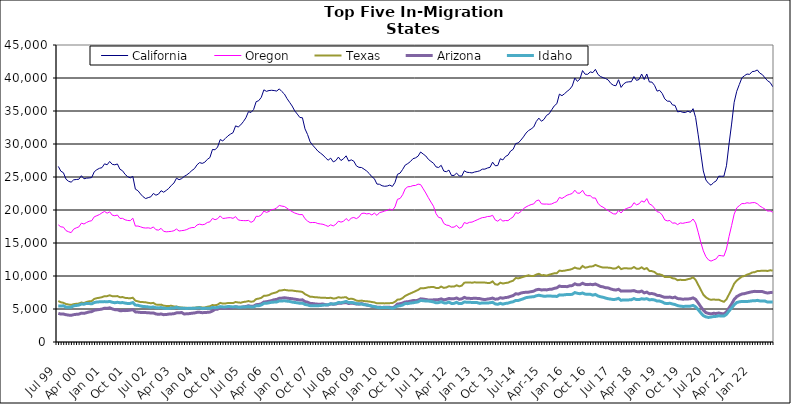
| Category | California | Oregon | Texas | Arizona | Idaho |
|---|---|---|---|---|---|
| Jul 99 | 26605 | 17749 | 6209 | 4339 | 5471 |
| Aug 99 | 25882 | 17447 | 6022 | 4228 | 5444 |
| Sep 99 | 25644 | 17401 | 5941 | 4237 | 5488 |
| Oct 99 | 24669 | 16875 | 5751 | 4134 | 5279 |
| Nov 99 | 24353 | 16701 | 5680 | 4073 | 5260 |
| Dec 99 | 24218 | 16570 | 5619 | 4042 | 5269 |
| Jan 00 | 24574 | 17109 | 5736 | 4142 | 5485 |
| Feb 00 | 24620 | 17295 | 5789 | 4192 | 5530 |
| Mar 00 | 24655 | 17436 | 5826 | 4226 | 5590 |
| Apr 00 | 25195 | 18009 | 5980 | 4375 | 5748 |
| May 00 | 24730 | 17875 | 5897 | 4337 | 5729 |
| Jun 00 | 24825 | 18113 | 6070 | 4444 | 5853 |
| Jul 00 | 24857 | 18294 | 6163 | 4555 | 5824 |
| Aug 00 | 24913 | 18376 | 6199 | 4603 | 5788 |
| Sep 00 | 25792 | 18971 | 6529 | 4804 | 5976 |
| Oct 00 | 26106 | 19135 | 6643 | 4870 | 6058 |
| Nov 00 | 26315 | 19306 | 6705 | 4926 | 6085 |
| Dec 00 | 26415 | 19570 | 6793 | 4991 | 6096 |
| Jan 01 | 26995 | 19781 | 6942 | 5122 | 6119 |
| Feb 01 | 26851 | 19519 | 6948 | 5089 | 6090 |
| Mar 01 | 27352 | 19720 | 7080 | 5180 | 6143 |
| Apr 01 | 26918 | 19221 | 6943 | 5020 | 6020 |
| May 01 | 26848 | 19126 | 6924 | 4899 | 5950 |
| Jun 01 | 26974 | 19241 | 6959 | 4895 | 6019 |
| Jul 01 | 26172 | 18725 | 6778 | 4737 | 5951 |
| Aug 01 | 25943 | 18736 | 6810 | 4757 | 5973 |
| Sep 01 | 25399 | 18514 | 6688 | 4753 | 5895 |
| Oct 01 | 25050 | 18415 | 6650 | 4780 | 5833 |
| Nov 01 | 24873 | 18381 | 6631 | 4826 | 5850 |
| Dec 01 | 25099 | 18765 | 6708 | 4898 | 5969 |
| Jan 02 | 23158 | 17561 | 6261 | 4560 | 5595 |
| Feb 02 | 22926 | 17573 | 6162 | 4531 | 5560 |
| Mar 02 | 22433 | 17452 | 6052 | 4481 | 5458 |
| Apr 02 | 22012 | 17314 | 6046 | 4458 | 5380 |
| May 02 | 21733 | 17267 | 6007 | 4452 | 5358 |
| Jun 02 | 21876 | 17298 | 5933 | 4444 | 5315 |
| Jul 02 | 21997 | 17209 | 5873 | 4383 | 5243 |
| Aug 02 | 22507 | 17436 | 5929 | 4407 | 5315 |
| Sep 02 | 22244 | 17010 | 5672 | 4248 | 5192 |
| Oct 02 | 22406 | 16952 | 5625 | 4191 | 5167 |
| Nov 02 | 22922 | 17223 | 5663 | 4242 | 5221 |
| Dec 02 | 22693 | 16770 | 5499 | 4142 | 5120 |
| Jan 03 | 22964 | 16694 | 5463 | 4166 | 5089 |
| Feb 03 | 23276 | 16727 | 5461 | 4226 | 5077 |
| Mar 03 | 23736 | 16766 | 5486 | 4251 | 5145 |
| Apr 03 | 24079 | 16859 | 5389 | 4289 | 5145 |
| May 03 | 24821 | 17117 | 5378 | 4415 | 5254 |
| Jun 03 | 24592 | 16812 | 5273 | 4426 | 5135 |
| Jul 03 | 24754 | 16875 | 5226 | 4466 | 5124 |
| Aug 03 | 25092 | 16922 | 5181 | 4244 | 5100 |
| Sep 03 | 25316 | 17036 | 5181 | 4279 | 5086 |
| Oct 03 | 25622 | 17228 | 5139 | 4301 | 5110 |
| Nov 03 | 25984 | 17335 | 5175 | 4362 | 5091 |
| Dec 03 | 26269 | 17350 | 5189 | 4396 | 5113 |
| Jan 04 | 26852 | 17734 | 5255 | 4492 | 5152 |
| Feb 04 | 27184 | 17860 | 5301 | 4502 | 5183 |
| Mar 04 | 27062 | 17757 | 5227 | 4443 | 5056 |
| Apr 04 | 27238 | 17840 | 5227 | 4461 | 5104 |
| May 04 | 27671 | 18113 | 5345 | 4493 | 5095 |
| Jun 04 | 27949 | 18201 | 5416 | 4532 | 5103 |
| Jul 04 | 29172 | 18727 | 5597 | 4697 | 5231 |
| Aug 04 | 29122 | 18529 | 5561 | 4945 | 5197 |
| Sep 04 | 29542 | 18678 | 5656 | 4976 | 5237 |
| Oct 04 | 30674 | 19108 | 5922 | 5188 | 5363 |
| Nov 04 | 30472 | 18716 | 5823 | 5106 | 5321 |
| Dec 04 | 30831 | 18755 | 5838 | 5135 | 5312 |
| Jan 05 | 31224 | 18823 | 5906 | 5155 | 5374 |
| Feb 05 | 31495 | 18842 | 5898 | 5168 | 5357 |
| Mar 05 | 31714 | 18738 | 5894 | 5212 | 5313 |
| Apr 05 | 32750 | 18998 | 6060 | 5340 | 5350 |
| May 05 | 32575 | 18504 | 5989 | 5269 | 5276 |
| Jun 05 | 32898 | 18414 | 5954 | 5252 | 5271 |
| Jul 05 | 33384 | 18395 | 6062 | 5322 | 5322 |
| Aug 05 | 33964 | 18381 | 6113 | 5375 | 5316 |
| Sep 05 | 34897 | 18426 | 6206 | 5493 | 5362 |
| Oct 05 | 34780 | 18132 | 6100 | 5408 | 5308 |
| Nov 05 | 35223 | 18332 | 6162 | 5434 | 5314 |
| Dec 05 | 36415 | 19047 | 6508 | 5658 | 5487 |
| Jan 06 | 36567 | 19032 | 6576 | 5688 | 5480 |
| Feb 06 | 37074 | 19257 | 6692 | 5792 | 5616 |
| Mar 06 | 38207 | 19845 | 6993 | 6052 | 5850 |
| Apr 06 | 37976 | 19637 | 7024 | 6101 | 5864 |
| May 06 | 38099 | 19781 | 7114 | 6178 | 5943 |
| Jun 06 | 38141 | 20061 | 7331 | 6276 | 6018 |
| Jul 06 | 38097 | 20111 | 7431 | 6399 | 6046 |
| Aug 06 | 38021 | 20333 | 7542 | 6450 | 6064 |
| Sep 06 | 38349 | 20686 | 7798 | 6627 | 6232 |
| Oct 06 | 37947 | 20591 | 7825 | 6647 | 6216 |
| Nov 06 | 37565 | 20526 | 7907 | 6707 | 6244 |
| Dec 06 | 36884 | 20272 | 7840 | 6648 | 6192 |
| Jan 07 | 36321 | 19984 | 7789 | 6597 | 6151 |
| Feb 07 | 35752 | 19752 | 7799 | 6554 | 6048 |
| Mar 07 | 35025 | 19547 | 7737 | 6487 | 5989 |
| Apr 07 | 34534 | 19412 | 7685 | 6430 | 5937 |
| May 07 | 34022 | 19296 | 7654 | 6353 | 5858 |
| Jun 07 | 33974 | 19318 | 7577 | 6390 | 5886 |
| Jul 07 | 32298 | 18677 | 7250 | 6117 | 5682 |
| Aug 07 | 31436 | 18322 | 7070 | 6034 | 5617 |
| Sep 07 | 30331 | 18087 | 6853 | 5847 | 5500 |
| Oct 07 | 29813 | 18108 | 6839 | 5821 | 5489 |
| Nov 07 | 29384 | 18105 | 6777 | 5769 | 5481 |
| Dec 07 | 28923 | 17949 | 6760 | 5733 | 5499 |
| Jan 08 | 28627 | 17890 | 6721 | 5732 | 5521 |
| Feb 08 | 28328 | 17834 | 6719 | 5749 | 5579 |
| Mar 08 | 27911 | 17680 | 6690 | 5650 | 5614 |
| Apr 08 | 27543 | 17512 | 6656 | 5612 | 5635 |
| May 08 | 27856 | 17754 | 6705 | 5774 | 5798 |
| Jun 08 | 27287 | 17589 | 6593 | 5717 | 5745 |
| Jul 08 | 27495 | 17834 | 6623 | 5761 | 5807 |
| Aug 08 | 28018 | 18309 | 6789 | 5867 | 5982 |
| Sep-08 | 27491 | 18164 | 6708 | 5864 | 5954 |
| Oct 08 | 27771 | 18291 | 6755 | 5942 | 6032 |
| Nov 08 | 28206 | 18706 | 6787 | 5970 | 6150 |
| Dec 08 | 27408 | 18353 | 6505 | 5832 | 5975 |
| Jan 09 | 27601 | 18778 | 6569 | 5890 | 5995 |
| Feb 09 | 27394 | 18863 | 6483 | 5845 | 5936 |
| Mar 09 | 26690 | 18694 | 6273 | 5751 | 5806 |
| Apr 09 | 26461 | 18943 | 6222 | 5735 | 5777 |
| May 09 | 26435 | 19470 | 6272 | 5819 | 5767 |
| Jun 09 | 26187 | 19522 | 6199 | 5700 | 5649 |
| Jul 09 | 25906 | 19408 | 6171 | 5603 | 5617 |
| Aug 09 | 25525 | 19469 | 6128 | 5533 | 5540 |
| Sep 09 | 25050 | 19249 | 6059 | 5405 | 5437 |
| Oct 09 | 24741 | 19529 | 6004 | 5349 | 5369 |
| Nov 09 | 23928 | 19187 | 5854 | 5271 | 5248 |
| Dec 09 | 23899 | 19607 | 5886 | 5261 | 5195 |
| Jan 10 | 23676 | 19703 | 5881 | 5232 | 5234 |
| Feb 10 | 23592 | 19845 | 5850 | 5272 | 5236 |
| Mar 10 | 23634 | 19946 | 5864 | 5278 | 5219 |
| Apr 10 | 23774 | 20134 | 5889 | 5257 | 5201 |
| May 10 | 23567 | 19966 | 5897 | 5172 | 5105 |
| Jun 10 | 24166 | 20464 | 6087 | 5356 | 5237 |
| Jul 10 | 25410 | 21627 | 6417 | 5742 | 5452 |
| Aug 10 | 25586 | 21744 | 6465 | 5797 | 5491 |
| Sep 10 | 26150 | 22314 | 6667 | 5907 | 5609 |
| Oct 10 | 26807 | 23219 | 6986 | 6070 | 5831 |
| Nov 10 | 27033 | 23520 | 7179 | 6100 | 5810 |
| Dec 10 | 27332 | 23551 | 7361 | 6182 | 5898 |
| Jan 11 | 27769 | 23697 | 7525 | 6276 | 5938 |
| Feb 11 | 27898 | 23718 | 7708 | 6267 | 6016 |
| Mar 11 | 28155 | 23921 | 7890 | 6330 | 6081 |
| Apr 11 | 28790 | 23847 | 8146 | 6544 | 6305 |
| May 11 | 28471 | 23215 | 8131 | 6502 | 6248 |
| Jun 11 | 28191 | 22580 | 8199 | 6445 | 6217 |
| Jul 11 | 27678 | 21867 | 8291 | 6368 | 6202 |
| Aug 11 | 27372 | 21203 | 8321 | 6356 | 6146 |
| Sep 11 | 27082 | 20570 | 8341 | 6387 | 6075 |
| Oct 11 | 26528 | 19442 | 8191 | 6402 | 5932 |
| Nov 11 | 26440 | 18872 | 8176 | 6426 | 5968 |
| Dec 11 | 26770 | 18784 | 8401 | 6533 | 6106 |
| Jan 12 | 25901 | 17963 | 8202 | 6390 | 5933 |
| Feb 12 | 25796 | 17718 | 8266 | 6456 | 5900 |
| Mar 12 | 26042 | 17647 | 8456 | 6600 | 6054 |
| Apr 12 | 25239 | 17386 | 8388 | 6534 | 5838 |
| May 12 | 25238 | 17407 | 8401 | 6558 | 5854 |
| Jun 12 | 25593 | 17673 | 8594 | 6669 | 6009 |
| Jul 12 | 25155 | 17237 | 8432 | 6474 | 5817 |
| Aug 12 | 25146 | 17391 | 8536 | 6539 | 5842 |
| Sep 12 | 25942 | 18102 | 8989 | 6759 | 6061 |
| Oct 12 | 25718 | 17953 | 9012 | 6618 | 6027 |
| Nov 12 | 25677 | 18134 | 9032 | 6611 | 6009 |
| Dec 12 | 25619 | 18166 | 8981 | 6601 | 5999 |
| Jan 13 | 25757 | 18344 | 9051 | 6627 | 5989 |
| Feb-13 | 25830 | 18512 | 9001 | 6606 | 5968 |
| Mar-13 | 25940 | 18689 | 9021 | 6577 | 5853 |
| Apr 13 | 26187 | 18844 | 9013 | 6478 | 5925 |
| May 13 | 26192 | 18884 | 9003 | 6431 | 5924 |
| Jun-13 | 26362 | 19013 | 8948 | 6508 | 5896 |
| Jul 13 | 26467 | 19037 | 8958 | 6559 | 5948 |
| Aug 13 | 27253 | 19198 | 9174 | 6655 | 6020 |
| Sep 13 | 26711 | 18501 | 8747 | 6489 | 5775 |
| Oct 13 | 26733 | 18301 | 8681 | 6511 | 5711 |
| Nov 13 | 27767 | 18620 | 8989 | 6709 | 5860 |
| Dec 13 | 27583 | 18320 | 8863 | 6637 | 5740 |
| Jan 14 | 28107 | 18409 | 8939 | 6735 | 5843 |
| Feb-14 | 28313 | 18383 | 8989 | 6779 | 5893 |
| Mar 14 | 28934 | 18696 | 9160 | 6918 | 6015 |
| Apr 14 | 29192 | 18946 | 9291 | 7036 | 6099 |
| May 14 | 30069 | 19603 | 9701 | 7314 | 6304 |
| Jun 14 | 30163 | 19487 | 9641 | 7252 | 6293 |
| Jul-14 | 30587 | 19754 | 9752 | 7415 | 6427 |
| Aug-14 | 31074 | 20201 | 9882 | 7499 | 6557 |
| Sep 14 | 31656 | 20459 | 9997 | 7536 | 6719 |
| Oct 14 | 32037 | 20663 | 10109 | 7555 | 6786 |
| Nov 14 | 32278 | 20825 | 9992 | 7628 | 6831 |
| Dec 14 | 32578 | 20918 | 10006 | 7705 | 6860 |
| Jan 15 | 33414 | 21396 | 10213 | 7906 | 7000 |
| Feb 15 | 33922 | 21518 | 10337 | 7982 | 7083 |
| Mar 15 | 33447 | 20942 | 10122 | 7891 | 7006 |
| Apr-15 | 33731 | 20893 | 10138 | 7906 | 6931 |
| May 15 | 34343 | 20902 | 10053 | 7895 | 6952 |
| Jun-15 | 34572 | 20870 | 10192 | 7973 | 6966 |
| Jul 15 | 35185 | 20916 | 10303 | 8000 | 6949 |
| Aug 15 | 35780 | 21115 | 10399 | 8126 | 6938 |
| Sep 15 | 36109 | 21246 | 10428 | 8207 | 6896 |
| Oct 15 | 37555 | 21908 | 10813 | 8477 | 7140 |
| Nov 15 | 37319 | 21750 | 10763 | 8390 | 7112 |
| Dec 15 | 37624 | 21990 | 10807 | 8395 | 7149 |
| Jan 16 | 37978 | 22248 | 10892 | 8388 | 7201 |
| Feb 16 | 38285 | 22369 | 10951 | 8508 | 7192 |
| Mar 16 | 38792 | 22506 | 11075 | 8547 | 7226 |
| Apr 16 | 39994 | 22999 | 11286 | 8815 | 7487 |
| May 16 | 39488 | 22548 | 11132 | 8673 | 7382 |
| Jun 16 | 39864 | 22556 | 11100 | 8682 | 7315 |
| Jul 16 | 41123 | 22989 | 11516 | 8903 | 7420 |
| Aug 16 | 40573 | 22333 | 11251 | 8731 | 7261 |
| Sep 16 | 40560 | 22162 | 11340 | 8692 | 7216 |
| Oct 16 | 40923 | 22172 | 11456 | 8742 | 7233 |
| Nov 16 | 40817 | 21818 | 11459 | 8685 | 7101 |
| Dec 16 | 41311 | 21815 | 11681 | 8783 | 7203 |
| Jan 17 | 40543 | 21029 | 11524 | 8609 | 6982 |
| Feb 17 | 40218 | 20613 | 11385 | 8416 | 6852 |
| Mar 17 | 40052 | 20425 | 11276 | 8354 | 6775 |
| Apr 17 | 39913 | 20147 | 11297 | 8218 | 6653 |
| May 17 | 39695 | 19910 | 11265 | 8196 | 6552 |
| Jun 17 | 39177 | 19650 | 11225 | 8034 | 6500 |
| Jul 17 | 38901 | 19419 | 11115 | 7923 | 6429 |
| Aug 17 | 38827 | 19389 | 11168 | 7867 | 6479 |
| Sep 17 | 39736 | 19936 | 11426 | 7991 | 6609 |
| Oct 17 | 38576 | 19547 | 11041 | 7708 | 6315 |
| Nov 17 | 39108 | 20013 | 11158 | 7746 | 6381 |
| Dec 17 | 39359 | 20202 | 11185 | 7743 | 6366 |
| Jan 18 | 39420 | 20362 | 11118 | 7736 | 6380 |
| Feb 18 | 39440 | 20476 | 11128 | 7741 | 6407 |
| Mar 18 | 40218 | 21106 | 11362 | 7789 | 6578 |
| Apr 18 | 39637 | 20788 | 11111 | 7642 | 6423 |
| May 18 | 39777 | 20933 | 11097 | 7591 | 6430 |
| Jun 18 | 40602 | 21381 | 11317 | 7721 | 6554 |
| Jul 18 | 39767 | 21189 | 11038 | 7445 | 6489 |
| Aug 18 | 40608 | 21729 | 11200 | 7560 | 6569 |
| Sep 18 | 39395 | 20916 | 10772 | 7318 | 6383 |
| Oct 18 | 39383 | 20724 | 10740 | 7344 | 6429 |
| Nov 18 | 38891 | 20265 | 10605 | 7255 | 6365 |
| Dec 18 | 38013 | 19741 | 10292 | 7069 | 6205 |
| Jan 19 | 38130 | 19643 | 10261 | 7032 | 6203 |
| Feb 19 | 37658 | 19237 | 10132 | 6892 | 6073 |
| Mar 19 | 36831 | 18492 | 9848 | 6766 | 5863 |
| Apr 19 | 36492 | 18349 | 9839 | 6763 | 5827 |
| May 19 | 36481 | 18407 | 9867 | 6809 | 5873 |
| Jun 19 | 35925 | 17998 | 9661 | 6698 | 5761 |
| Jul 19 | 35843 | 18049 | 9598 | 6800 | 5673 |
| Aug 19 | 34870 | 17785 | 9361 | 6577 | 5512 |
| Sep 19 | 34945 | 18038 | 9428 | 6547 | 5437 |
| Oct 19 | 34802 | 17977 | 9385 | 6483 | 5390 |
| Nov 19 | 34775 | 18072 | 9403 | 6511 | 5401 |
| Dec 19 | 34976 | 18140 | 9518 | 6521 | 5419 |
| Jan 20 | 34774 | 18209 | 9594 | 6561 | 5434 |
| Feb 20 | 35352 | 18632 | 9804 | 6682 | 5543 |
| Mar 20 | 34013 | 18041 | 9411 | 6464 | 5330 |
| Apr 20 | 31385 | 16629 | 8666 | 5922 | 4906 |
| May 20 | 28657 | 15123 | 7927 | 5355 | 4419 |
| Jun 20 | 25915 | 13817 | 7164 | 4815 | 3992 |
| Jul 20 | 24545 | 12926 | 6776 | 4457 | 3810 |
| Aug 20 | 24048 | 12443 | 6521 | 4326 | 3720 |
| Sep 20 | 23756 | 12258 | 6386 | 4266 | 3784 |
| Oct 20 | 24166 | 12429 | 6452 | 4347 | 3861 |
| Nov 20 | 24404 | 12597 | 6386 | 4324 | 3883 |
| Dec 20 | 25120 | 13122 | 6420 | 4394 | 3974 |
| Jan 21 | 25111 | 13080 | 6236 | 4304 | 3924 |
| Feb 21 | 25114 | 13015 | 6094 | 4260 | 3930 |
| Mar 21 | 26701 | 14096 | 6455 | 4567 | 4185 |
| Apr 21 | 29998 | 15978 | 7222 | 5164 | 4697 |
| May 21 | 33020 | 17641 | 7969 | 5748 | 5148 |
| Jun 21 | 36320 | 19369 | 8840 | 6450 | 5628 |
| Jul 21 | 37989 | 20320 | 9306 | 6877 | 5984 |
| Aug 21 | 39007 | 20657 | 9615 | 7094 | 6084 |
| Sep 21 | 40023 | 20974 | 9914 | 7277 | 6151 |
| Oct 21 | 40348 | 20966 | 10003 | 7327 | 6140 |
| Nov 21 | 40599 | 21096 | 10203 | 7437 | 6136 |
| Dec 21 | 40548 | 21032 | 10328 | 7532 | 6183 |
| Jan 22 | 40967 | 21106 | 10535 | 7618 | 6237 |
| Feb 22 | 41019 | 21125 | 10579 | 7673 | 6236 |
| Mar 22 | 41220 | 20949 | 10751 | 7660 | 6310 |
| Apr 22 | 40730 | 20602 | 10772 | 7661 | 6221 |
| May 22 | 40504 | 20370 | 10792 | 7636 | 6210 |
| Jun 22 | 40013 | 20127 | 10802 | 7504 | 6199 |
| Jul 22 | 39582 | 19846 | 10761 | 7419 | 6050 |
| Aug 22 | 39321 | 19865 | 10868 | 7487 | 6071 |
| Sep 22 | 38685 | 19666 | 10811 | 7536 | 6074 |